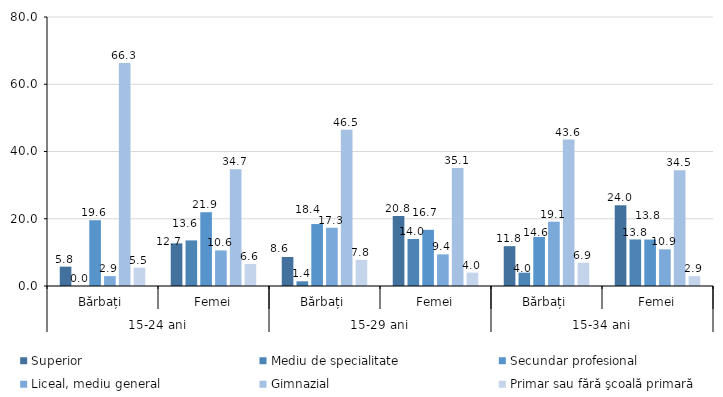
| Category | Superior | Mediu de specialitate | Secundar profesional | Liceal, mediu general | Gimnazial | Primar sau fără şcoală primară |
|---|---|---|---|---|---|---|
| 0 | 5.754 | 0 | 19.558 | 2.938 | 66.298 | 5.453 |
| 1 | 12.681 | 13.558 | 21.939 | 10.578 | 34.686 | 6.558 |
| 2 | 8.627 | 1.397 | 18.423 | 17.322 | 46.454 | 7.777 |
| 3 | 20.828 | 13.973 | 16.711 | 9.413 | 35.099 | 3.976 |
| 4 | 11.849 | 3.965 | 14.568 | 19.124 | 43.555 | 6.941 |
| 5 | 24.044 | 13.842 | 13.815 | 10.903 | 34.456 | 2.94 |